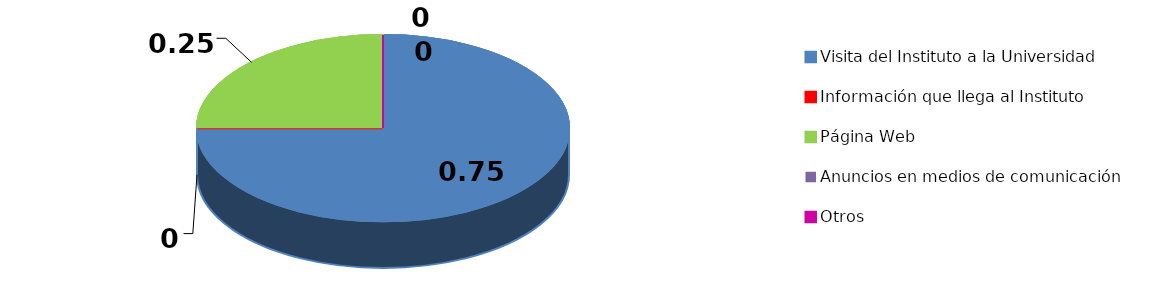
| Category | Series 0 |
|---|---|
| Visita del Instituto a la Universidad | 3 |
| Información que llega al Instituto | 0 |
| Página Web | 1 |
| Anuncios en medios de comunicación | 0 |
| Otros | 0 |